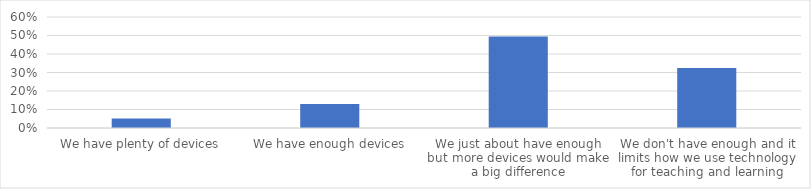
| Category | % of Respondents |
|---|---|
| We have plenty of devices | 0.052 |
| We have enough devices | 0.13 |
| We just about have enough but more devices would make a big difference | 0.494 |
| We don't have enough and it limits how we use technology for teaching and learning | 0.324 |